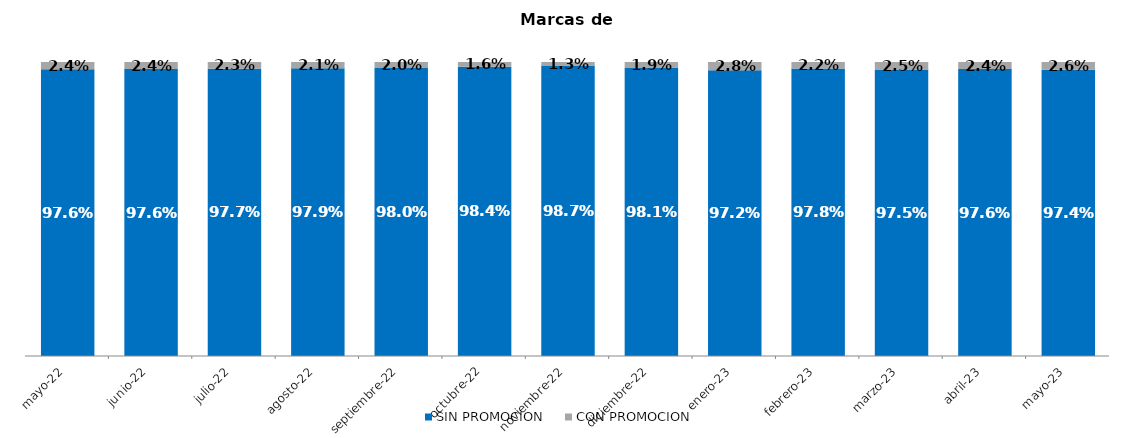
| Category | SIN PROMOCION   | CON PROMOCION   |
|---|---|---|
| 2022-05-01 | 0.976 | 0.024 |
| 2022-06-01 | 0.976 | 0.024 |
| 2022-07-01 | 0.977 | 0.023 |
| 2022-08-01 | 0.979 | 0.021 |
| 2022-09-01 | 0.98 | 0.02 |
| 2022-10-01 | 0.984 | 0.016 |
| 2022-11-01 | 0.987 | 0.013 |
| 2022-12-01 | 0.981 | 0.019 |
| 2023-01-01 | 0.972 | 0.028 |
| 2023-02-01 | 0.978 | 0.022 |
| 2023-03-01 | 0.975 | 0.025 |
| 2023-04-01 | 0.976 | 0.024 |
| 2023-05-01 | 0.974 | 0.026 |